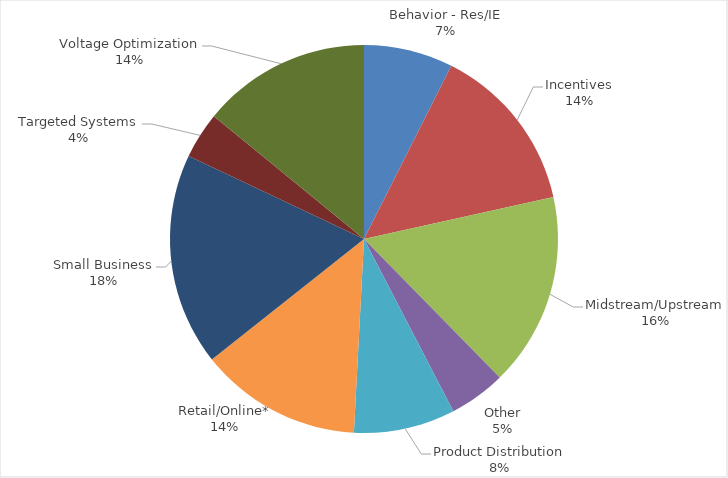
| Category | Series 0 |
|---|---|
| Behavior - Res/IE | 18880.114 |
| Incentives | 35829.551 |
| Midstream/Upstream | 40965.085 |
| Other | 11980.328 |
| Product Distribution | 21462.998 |
| Retail/Online* | 34338.821 |
| Small Business | 44927.082 |
| Targeted Systems | 9862.756 |
| Voltage Optimization | 35780.204 |